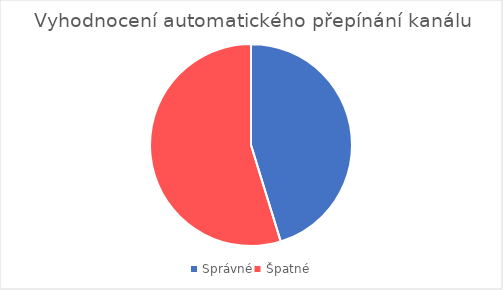
| Category | Series 0 |
|---|---|
| Správné | 38 |
| Špatné | 46 |